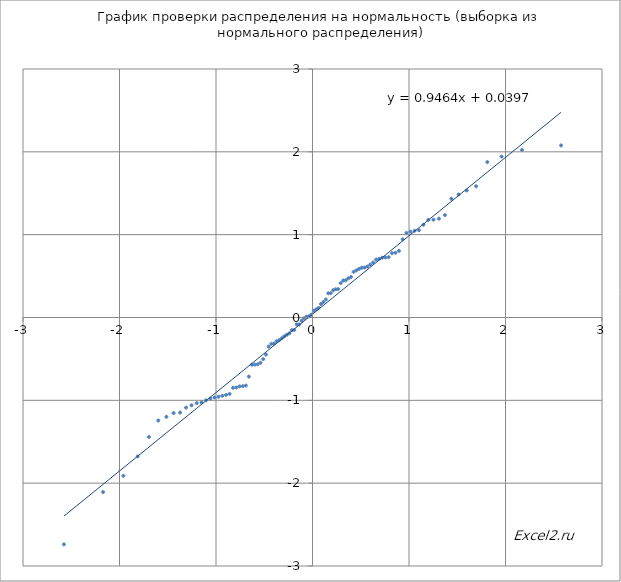
| Category | Нормальное (сортированный список) |
|---|---|
| -2.5758293035489 | -2.739 |
| -2.17009037758456 | -2.108 |
| -1.9599639845400538 | -1.912 |
| -1.8119106729525978 | -1.677 |
| -1.6953977102721358 | -1.442 |
| -1.5981931399228173 | -1.244 |
| -1.5141018876192833 | -1.199 |
| -1.4395314709384572 | -1.154 |
| -1.3722038089987272 | -1.147 |
| -1.3105791121681303 | -1.088 |
| -1.253565438470451 | -1.06 |
| -1.2003588580308597 | -1.033 |
| -1.1503493803760083 | -1.025 |
| -1.1030625561995977 | -1 |
| -1.058121617684777 | -0.978 |
| -1.01522203321703 | -0.966 |
| -0.9741138770593097 | -0.957 |
| -0.9345892910734794 | -0.945 |
| -0.8964733640019161 | -0.934 |
| -0.859617364241913 | -0.923 |
| -0.8238936303385577 | -0.848 |
| -0.7891916526582219 | -0.845 |
| -0.7554150263604691 | -0.831 |
| -0.7224790519280626 | -0.829 |
| -0.6903088239330339 | -0.821 |
| -0.6588376927361878 | -0.713 |
| -0.6280060144375699 | -0.57 |
| -0.5977601260424784 | -0.568 |
| -0.5680514983389828 | -0.565 |
| -0.5388360302784504 | -0.547 |
| -0.5100734569685949 | -0.503 |
| -0.48172684958473044 | -0.447 |
| -0.4537621901698795 | -0.351 |
| -0.4261480078412782 | -0.318 |
| -0.3988550656423369 | -0.315 |
| -0.3718560893850747 | -0.287 |
| -0.3451255314704724 | -0.274 |
| -0.3186393639643752 | -0.251 |
| -0.2923748962268042 | -0.227 |
| -0.266310613204095 | -0.208 |
| -0.2404260311423079 | -0.191 |
| -0.21470156800174456 | -0.152 |
| -0.18911842627279254 | -0.151 |
| -0.16365848623314128 | -0.084 |
| -0.1383042079614045 | -0.083 |
| -0.11303854064456513 | -0.038 |
| -0.08784483789587168 | -0.009 |
| -0.06270677794321385 | 0.009 |
| -0.037608287661255936 | 0.013 |
| -0.012533469508069276 | 0.034 |
| 0.012533469508069276 | 0.082 |
| 0.037608287661255936 | 0.097 |
| 0.06270677794321385 | 0.116 |
| 0.08784483789587182 | 0.163 |
| 0.11303854064456527 | 0.187 |
| 0.13830420796140466 | 0.218 |
| 0.16365848623314114 | 0.293 |
| 0.18911842627279243 | 0.295 |
| 0.2147015680017444 | 0.329 |
| 0.2404260311423079 | 0.341 |
| 0.266310613204095 | 0.342 |
| 0.2923748962268042 | 0.416 |
| 0.3186393639643752 | 0.447 |
| 0.3451255314704724 | 0.449 |
| 0.3718560893850747 | 0.473 |
| 0.3988550656423369 | 0.489 |
| 0.4261480078412784 | 0.551 |
| 0.4537621901698797 | 0.569 |
| 0.48172684958473044 | 0.587 |
| 0.5100734569685947 | 0.601 |
| 0.5388360302784501 | 0.603 |
| 0.5680514983389827 | 0.615 |
| 0.5977601260424784 | 0.638 |
| 0.6280060144375699 | 0.663 |
| 0.6588376927361878 | 0.699 |
| 0.6903088239330339 | 0.708 |
| 0.7224790519280626 | 0.722 |
| 0.7554150263604691 | 0.724 |
| 0.7891916526582219 | 0.728 |
| 0.8238936303385577 | 0.776 |
| 0.8596173642419115 | 0.781 |
| 0.8964733640019159 | 0.805 |
| 0.9345892910734801 | 0.944 |
| 0.9741138770593097 | 1.021 |
| 1.01522203321703 | 1.036 |
| 1.058121617684777 | 1.047 |
| 1.1030625561995977 | 1.053 |
| 1.1503493803760083 | 1.12 |
| 1.2003588580308597 | 1.178 |
| 1.253565438470451 | 1.181 |
| 1.3105791121681303 | 1.194 |
| 1.3722038089987258 | 1.236 |
| 1.4395314709384563 | 1.433 |
| 1.5141018876192844 | 1.486 |
| 1.5981931399228169 | 1.533 |
| 1.6953977102721358 | 1.584 |
| 1.8119106729525971 | 1.876 |
| 1.9599639845400536 | 1.943 |
| 2.17009037758456 | 2.022 |
| 2.5758293035489 | 2.077 |